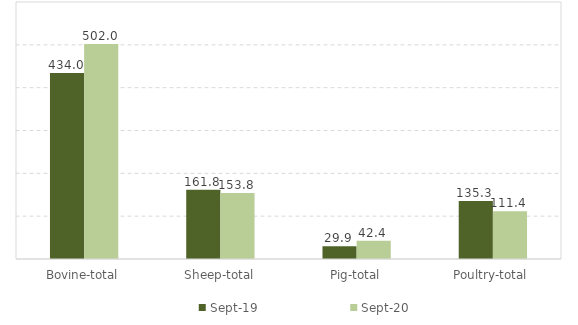
| Category | Sep-19 | Sep-20 |
|---|---|---|
| Bovine-total | 434 | 502 |
| Sheep-total | 161.8 | 153.8 |
| Pig-total | 29.9 | 42.4 |
| Poultry-total | 135.3 | 111.4 |